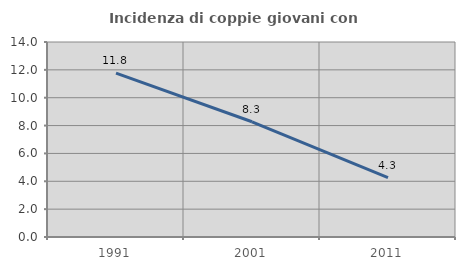
| Category | Incidenza di coppie giovani con figli |
|---|---|
| 1991.0 | 11.765 |
| 2001.0 | 8.273 |
| 2011.0 | 4.267 |